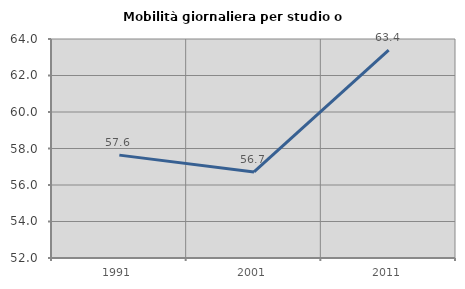
| Category | Mobilità giornaliera per studio o lavoro |
|---|---|
| 1991.0 | 57.636 |
| 2001.0 | 56.713 |
| 2011.0 | 63.391 |